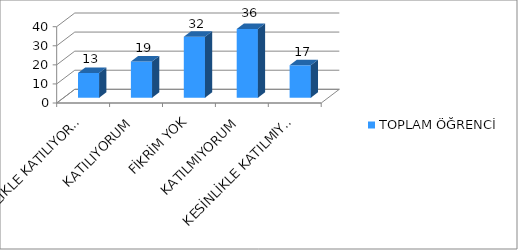
| Category | TOPLAM ÖĞRENCİ |
|---|---|
| KESİNLİKLE KATILIYORUM | 13 |
| KATILIYORUM | 19 |
| FİKRİM YOK | 32 |
| KATILMIYORUM | 36 |
| KESİNLİKLE KATILMIYORUM | 17 |